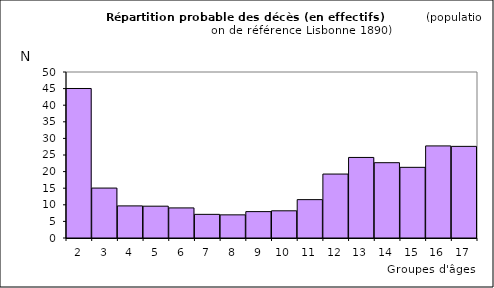
| Category | Series 0 |
|---|---|
| 2.0 | 45.034 |
| 3.0 | 15.041 |
| 4.0 | 9.669 |
| 5.0 | 9.584 |
| 6.0 | 9.06 |
| 7.0 | 7.123 |
| 8.0 | 6.971 |
| 9.0 | 7.945 |
| 10.0 | 8.19 |
| 11.0 | 11.555 |
| 12.0 | 19.261 |
| 13.0 | 24.265 |
| 14.0 | 22.681 |
| 15.0 | 21.283 |
| 16.0 | 27.736 |
| 17.0 | 27.601 |